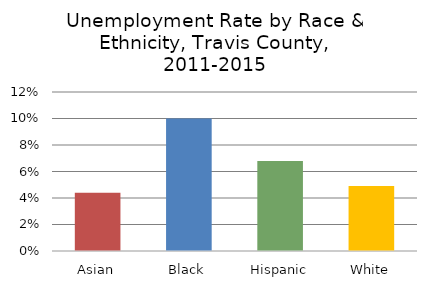
| Category | Series 0 |
|---|---|
| Asian | 0.044 |
| Black | 0.1 |
| Hispanic | 0.068 |
| White | 0.049 |